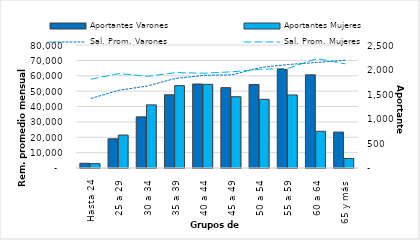
| Category | Aportantes Varones | Aportantes Mujeres |
|---|---|---|
| Hasta 24 | 96 | 89 |
| 25 a 29 | 594 | 670 |
| 30 a 34 | 1040 | 1283 |
| 35 a 39 | 1488 | 1674 |
| 40 a 44 | 1707 | 1701 |
| 45 a 49 | 1633 | 1449 |
| 50 a 54 | 1698 | 1396 |
| 55 a 59 | 2003 | 1485 |
| 60 a 64 | 1893 | 746 |
| 65 y más | 730 | 194 |